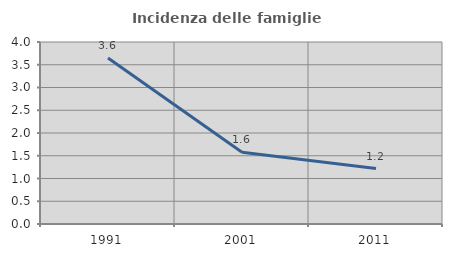
| Category | Incidenza delle famiglie numerose |
|---|---|
| 1991.0 | 3.649 |
| 2001.0 | 1.577 |
| 2011.0 | 1.22 |